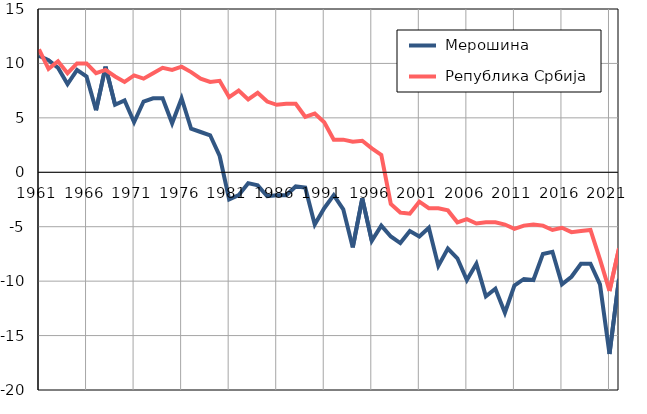
| Category |  Мерошина |  Република Србија |
|---|---|---|
| 1961.0 | 10.7 | 11.3 |
| 1962.0 | 10.3 | 9.5 |
| 1963.0 | 9.6 | 10.2 |
| 1964.0 | 8.1 | 9.1 |
| 1965.0 | 9.4 | 10 |
| 1966.0 | 8.8 | 10 |
| 1967.0 | 5.7 | 9.1 |
| 1968.0 | 9.7 | 9.4 |
| 1969.0 | 6.2 | 8.8 |
| 1970.0 | 6.6 | 8.3 |
| 1971.0 | 4.6 | 8.9 |
| 1972.0 | 6.5 | 8.6 |
| 1973.0 | 6.8 | 9.1 |
| 1974.0 | 6.8 | 9.6 |
| 1975.0 | 4.5 | 9.4 |
| 1976.0 | 6.8 | 9.7 |
| 1977.0 | 4 | 9.2 |
| 1978.0 | 3.7 | 8.6 |
| 1979.0 | 3.4 | 8.3 |
| 1980.0 | 1.5 | 8.4 |
| 1981.0 | -2.5 | 6.9 |
| 1982.0 | -2.1 | 7.5 |
| 1983.0 | -1 | 6.7 |
| 1984.0 | -1.2 | 7.3 |
| 1985.0 | -2.2 | 6.5 |
| 1986.0 | -2.1 | 6.2 |
| 1987.0 | -2.1 | 6.3 |
| 1988.0 | -1.3 | 6.3 |
| 1989.0 | -1.4 | 5.1 |
| 1990.0 | -4.8 | 5.4 |
| 1991.0 | -3.3 | 4.6 |
| 1992.0 | -2.1 | 3 |
| 1993.0 | -3.4 | 3 |
| 1994.0 | -6.9 | 2.8 |
| 1995.0 | -2.4 | 2.9 |
| 1996.0 | -6.3 | 2.2 |
| 1997.0 | -4.9 | 1.6 |
| 1998.0 | -5.9 | -2.9 |
| 1999.0 | -6.5 | -3.7 |
| 2000.0 | -5.4 | -3.8 |
| 2001.0 | -5.9 | -2.7 |
| 2002.0 | -5.1 | -3.3 |
| 2003.0 | -8.6 | -3.3 |
| 2004.0 | -7 | -3.5 |
| 2005.0 | -7.9 | -4.6 |
| 2006.0 | -9.9 | -4.3 |
| 2007.0 | -8.4 | -4.7 |
| 2008.0 | -11.4 | -4.6 |
| 2009.0 | -10.7 | -4.6 |
| 2010.0 | -12.9 | -4.8 |
| 2011.0 | -10.4 | -5.2 |
| 2012.0 | -9.8 | -4.9 |
| 2013.0 | -9.9 | -4.8 |
| 2014.0 | -7.5 | -4.9 |
| 2015.0 | -7.3 | -5.3 |
| 2016.0 | -10.3 | -5.1 |
| 2017.0 | -9.6 | -5.5 |
| 2018.0 | -8.4 | -5.4 |
| 2019.0 | -8.4 | -5.3 |
| 2020.0 | -10.3 | -8 |
| 2021.0 | -16.7 | -10.9 |
| 2022.0 | -9.8 | -7 |